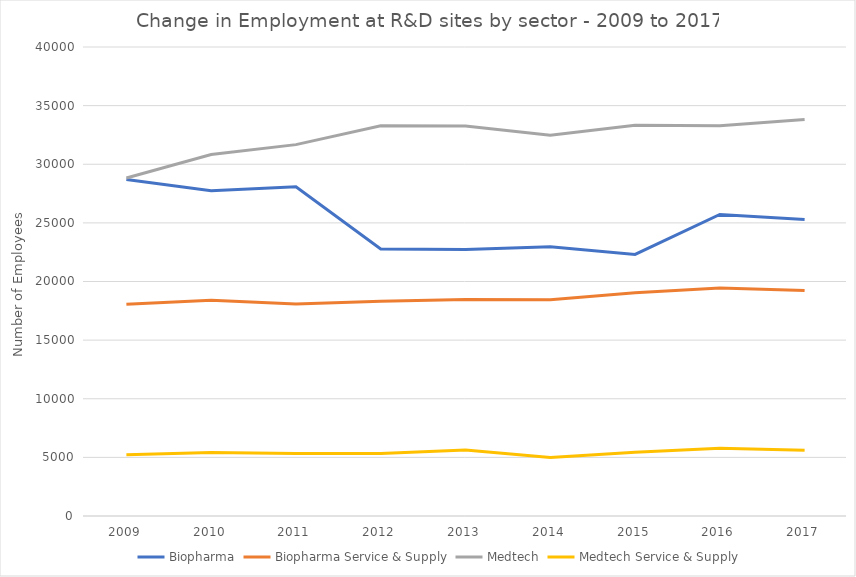
| Category | Biopharma | Biopharma Service & Supply | Medtech | Medtech Service & Supply |
|---|---|---|---|---|
| 2009 | 28691 | 18061 | 28823 | 5226 |
| 2010 | 27742 | 18403 | 30828 | 5408 |
| 2011 | 28077 | 18073 | 31673 | 5330 |
| 2012 | 22780 | 18318 | 33285 | 5337 |
| 2013 | 22723 | 18468 | 33259 | 5632 |
| 2014 | 22966 | 18448 | 32479 | 4998 |
| 2015 | 22308 | 19045 | 33330 | 5429 |
| 2016 | 25714 | 19440 | 33291 | 5776 |
| 2017 | 25298 | 19235 | 33823 | 5601 |